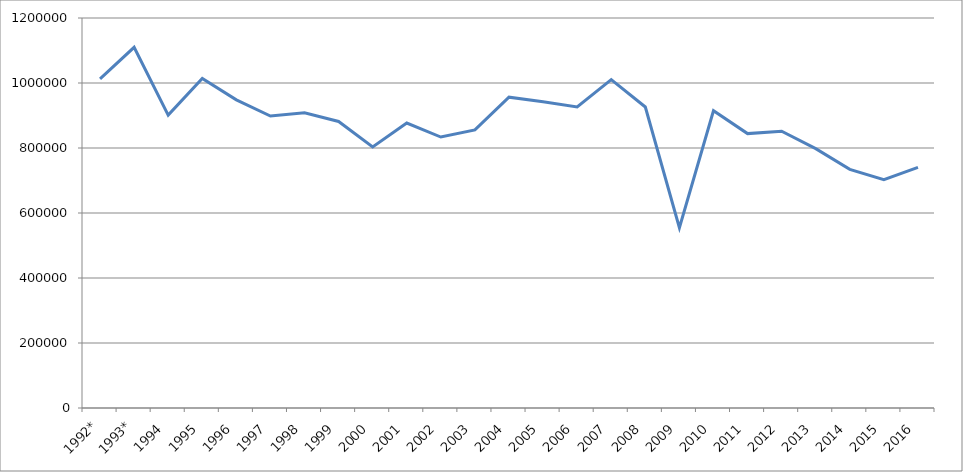
| Category | Series 0 |
|---|---|
| 1992* | 1012564 |
| 1993* | 1109900 |
| 1994 | 901212 |
| 1995 | 1014077 |
| 1996 | 948262 |
| 1997 | 898198 |
| 1998 | 908626 |
| 1999 | 881675 |
| 2000 | 803206 |
| 2001 | 876766 |
| 2002 | 833692.2 |
| 2003 | 855719.5 |
| 2004 | 956434 |
| 2005 | 942053 |
| 2006 | 926147.95 |
| 2007 | 1010147.07 |
| 2008 | 926213.1 |
| 2009 | 554571 |
| 2010 | 914718.31 |
| 2011 | 844254.3 |
| 2012 | 851568.7 |
| 2013 | 797961.4 |
| 2014 | 734419.948 |
| 2015 | 702358.74 |
| 2016 | 740334.4 |